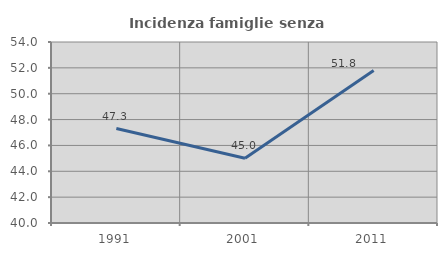
| Category | Incidenza famiglie senza nuclei |
|---|---|
| 1991.0 | 47.304 |
| 2001.0 | 45.013 |
| 2011.0 | 51.804 |